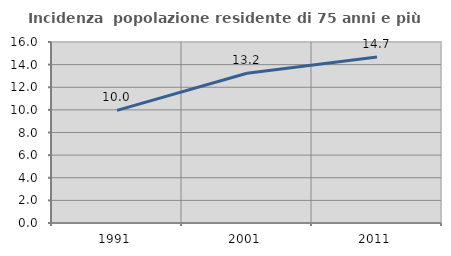
| Category | Incidenza  popolazione residente di 75 anni e più |
|---|---|
| 1991.0 | 9.953 |
| 2001.0 | 13.237 |
| 2011.0 | 14.671 |